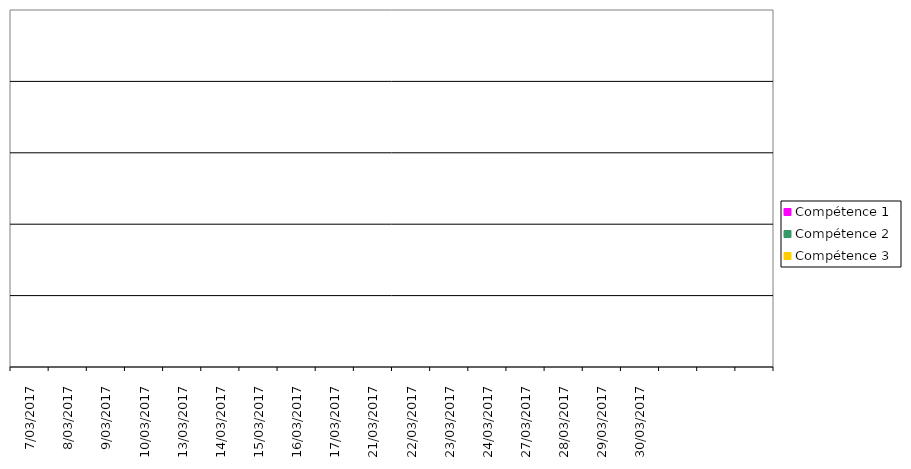
| Category | Compétence 1 | Compétence 2 | Compétence 3 |
|---|---|---|---|
| 7-03-2017 | 0 | 0 | 0 |
| 8-03-2017 | 0 | 0 | 0 |
| 9-03-2017 | 0 | 0 | 0 |
| 10-03-2017 | 0 | 0 | 0 |
| 13-03-2017 | 0 | 0 | 0 |
| 14-03-2017 | 0 | 0 | 0 |
| 15-03-2017 | 0 | 0 | 0 |
| 16-03-2017 | 0 | 0 | 0 |
| 17-03-2017 | 0 | 0 | 0 |
| 21-03-2017 | 0 | 0 | 0 |
| 22-03-2017 | 0 | 0 | 0 |
| 23-03-2017 | 0 | 0 | 0 |
| 24-03-2017 | 0 | 0 | 0 |
| 27-03-2017 | 0 | 0 | 0 |
| 28-03-2017 | 0 | 0 | 0 |
| 29-03-2017 | 0 | 0 | 0 |
| 30-03-2017 | 0 | 0 | 0 |